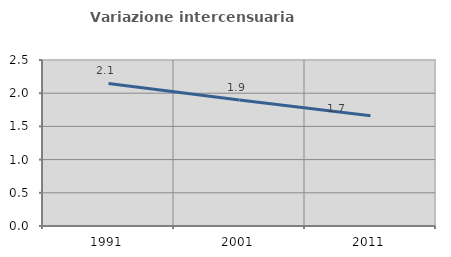
| Category | Variazione intercensuaria annua |
|---|---|
| 1991.0 | 2.148 |
| 2001.0 | 1.898 |
| 2011.0 | 1.66 |